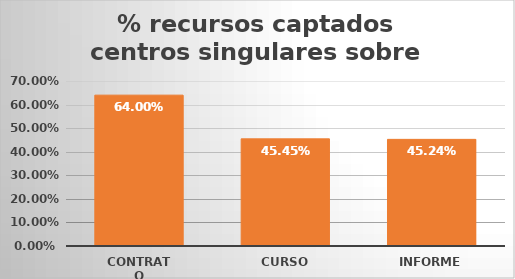
| Category | Series 0 |
|---|---|
| Contrato | 0.64 |
| Curso | 0.455 |
| Informe | 0.452 |